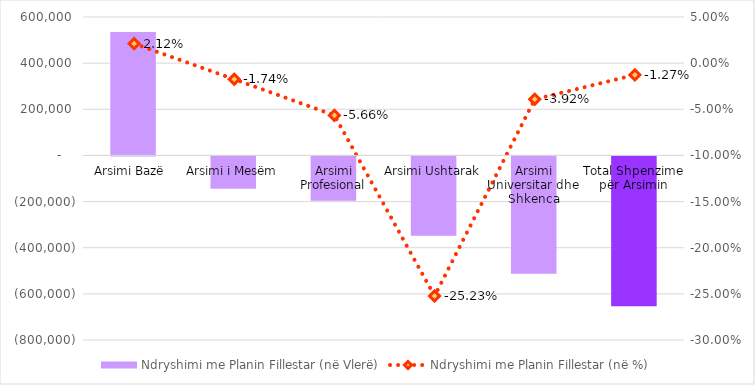
| Category | Ndryshimi me Planin Fillestar (në Vlerë) |
|---|---|
| Arsimi Bazë  | 535000 |
| Arsimi i Mesëm | -140000 |
| Arsimi Profesional | -191959 |
| Arsimi Ushtarak | -344000 |
| Arsimi Universitar dhe Shkenca | -508000 |
| Total Shpenzime për Arsimin | -648959 |